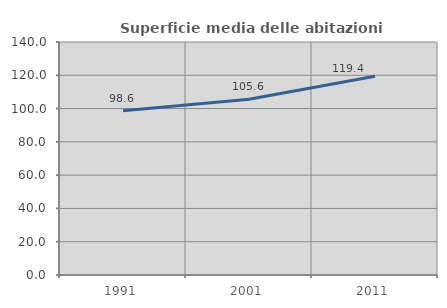
| Category | Superficie media delle abitazioni occupate |
|---|---|
| 1991.0 | 98.631 |
| 2001.0 | 105.603 |
| 2011.0 | 119.385 |